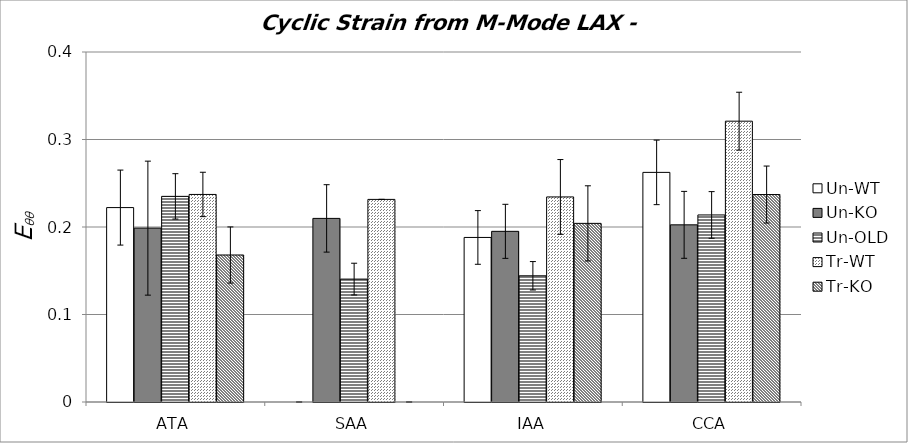
| Category | Un-WT | Un-KO | Un-OLD | Tr-WT | Tr-KO |
|---|---|---|---|---|---|
| 0 | 0.222 | 0.199 | 0.235 | 0.237 | 0.168 |
| 1 | 0 | 0.21 | 0.14 | 0.232 | 0 |
| 2 | 0.188 | 0.195 | 0.144 | 0.234 | 0.204 |
| 3 | 0.262 | 0.202 | 0.214 | 0.321 | 0.237 |